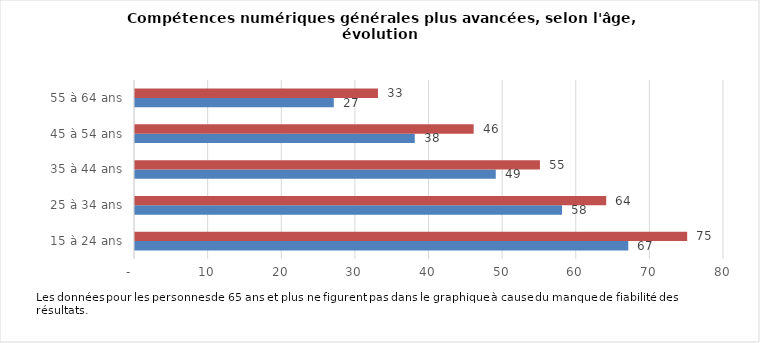
| Category | 2017 | 2019 |
|---|---|---|
| 15 à 24 ans | 67 | 75 |
| 25 à 34 ans | 58 | 64 |
| 35 à 44 ans | 49 | 55 |
| 45 à 54 ans | 38 | 46 |
| 55 à 64 ans | 27 | 33 |